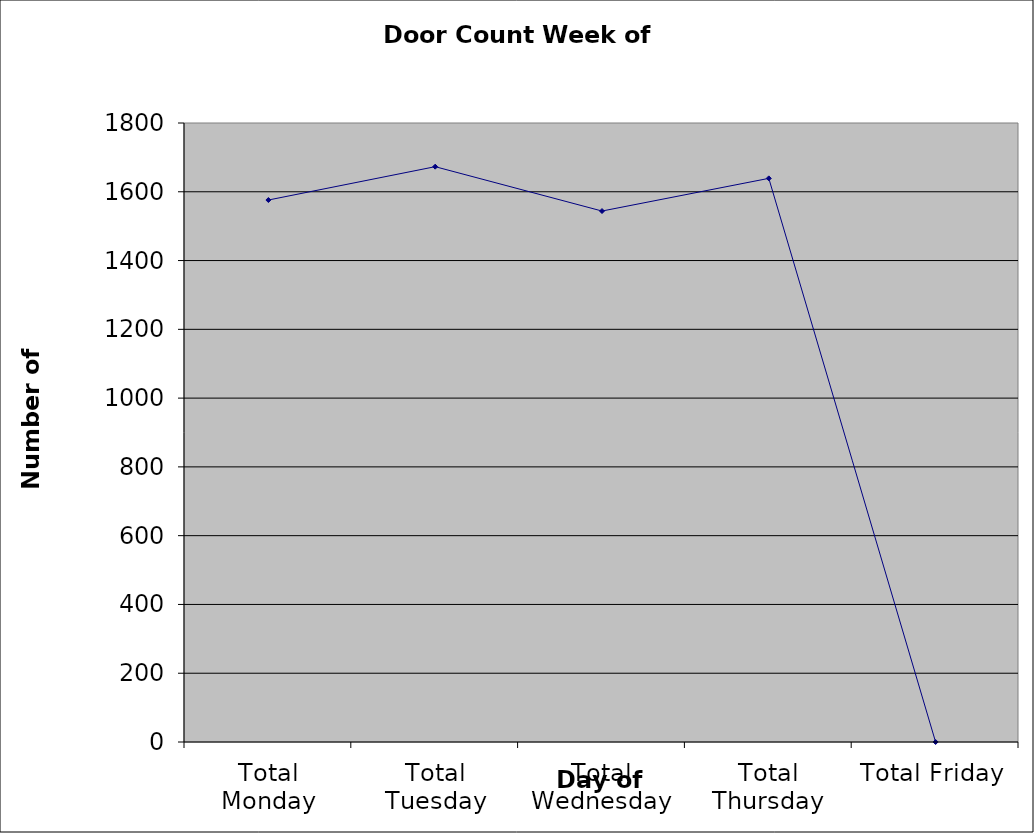
| Category | Series 0 |
|---|---|
| Total Monday | 1576 |
| Total Tuesday | 1673 |
| Total Wednesday | 1544 |
| Total Thursday | 1639 |
| Total Friday | 0 |